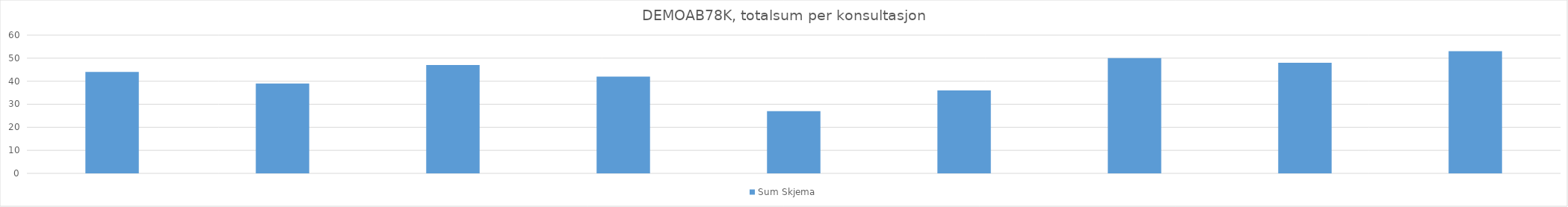
| Category | Sum Skjema |
|---|---|
| 09.02.2016 | 44 |
| 10.02.2016 | 39 |
| 11.02.2016 | 47 |
| 12.02.2016 | 42 |
| 13.02.2016 | 27 |
| 14.02.2016 | 36 |
| 21.02.2016 | 50 |
| 01.05.2019 | 48 |
| 02.05.2019 | 53 |